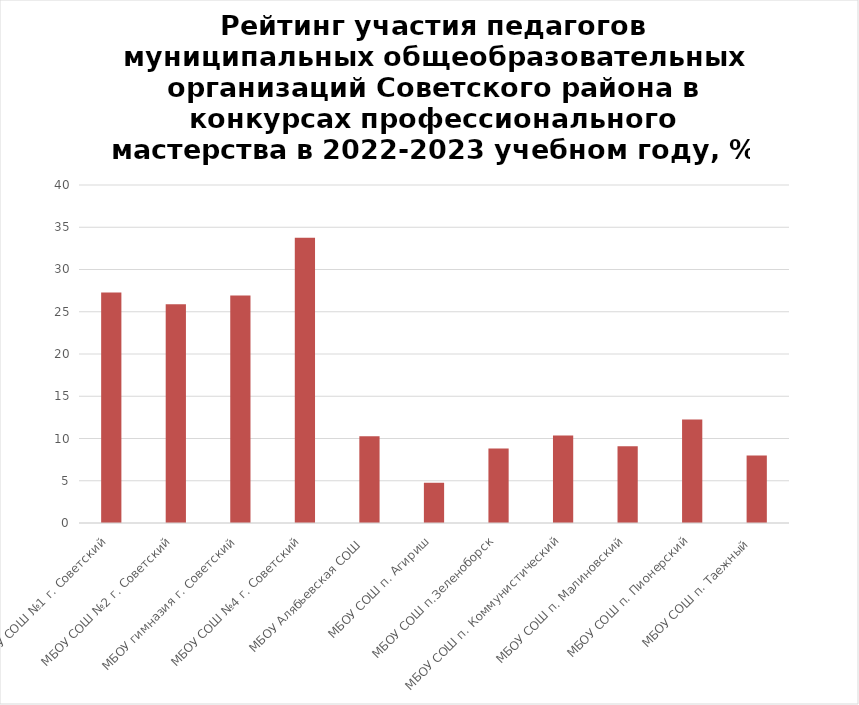
| Category | Доля участия, % |
|---|---|
| МБОУ СОШ №1 г. Советский | 27.273 |
| МБОУ СОШ №2 г. Советский | 25.882 |
| МБОУ гимназия г. Советский | 26.923 |
| МБОУ СОШ №4 г. Советский | 33.75 |
| МБОУ Алябьевская СОШ  | 10.256 |
| МБОУ СОШ п. Агириш | 4.762 |
| МБОУ СОШ п.Зеленоборск | 8.824 |
| МБОУ СОШ п. Коммунистический | 10.345 |
| МБОУ СОШ п. Малиновский | 9.091 |
| МБОУ СОШ п. Пионерский | 12.245 |
| МБОУ СОШ п. Таежный  | 8 |